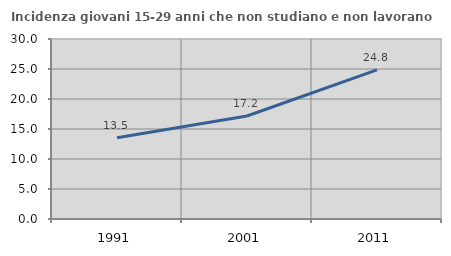
| Category | Incidenza giovani 15-29 anni che non studiano e non lavorano  |
|---|---|
| 1991.0 | 13.542 |
| 2001.0 | 17.164 |
| 2011.0 | 24.848 |